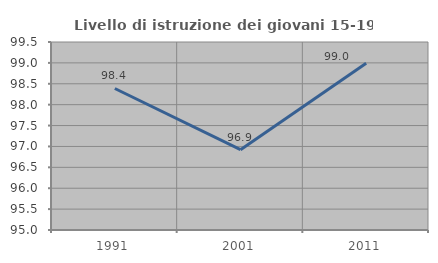
| Category | Livello di istruzione dei giovani 15-19 anni |
|---|---|
| 1991.0 | 98.387 |
| 2001.0 | 96.923 |
| 2011.0 | 98.99 |